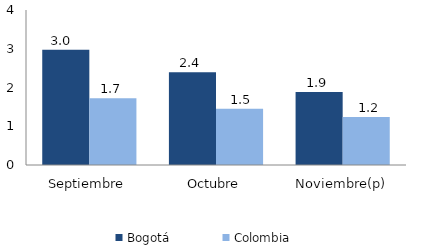
| Category | Bogotá | Colombia |
|---|---|---|
| Septiembre | 2.976 | 1.725 |
| Octubre | 2.396 | 1.454 |
| Noviembre(p) | 1.882 | 1.241 |